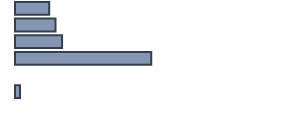
| Category | Series 0 |
|---|---|
| 0 | 13 |
| 1 | 15.4 |
| 2 | 17.9 |
| 3 | 51.8 |
| 4 | 0 |
| 5 | 1.9 |